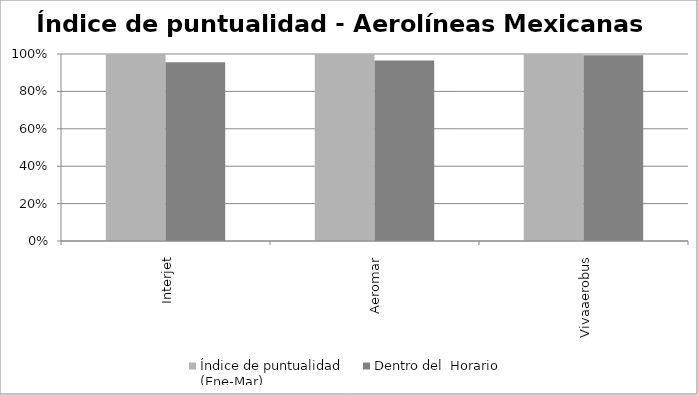
| Category | Índice de puntualidad
(Ene-Mar) | Dentro del  Horario |
|---|---|---|
| Interjet | 1 | 0.955 |
| Aeromar | 1 | 0.966 |
| Vivaaerobus | 1 | 0.993 |